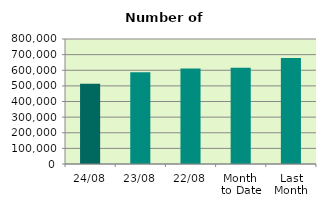
| Category | Series 0 |
|---|---|
| 24/08 | 513666 |
| 23/08 | 587734 |
| 22/08 | 611986 |
| Month 
to Date | 615820.667 |
| Last
Month | 677996.667 |